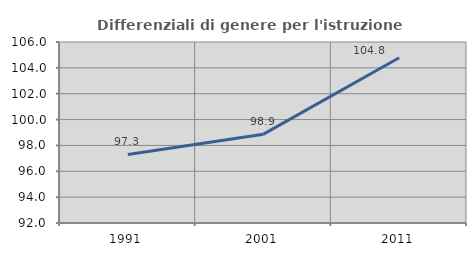
| Category | Differenziali di genere per l'istruzione superiore |
|---|---|
| 1991.0 | 97.305 |
| 2001.0 | 98.871 |
| 2011.0 | 104.777 |